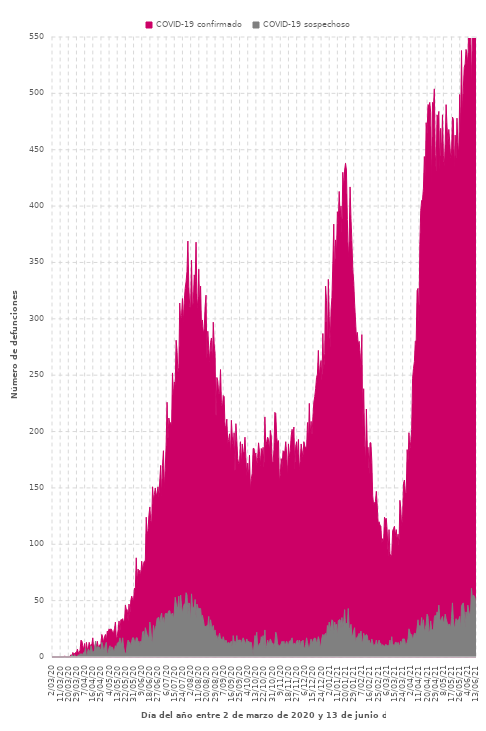
| Category | COVID-19 confirmado | COVID-19 sospechoso |
|---|---|---|
| 2020-03-02 | 0 | 0 |
| 2020-03-03 | 0 | 0 |
| 2020-03-04 | 0 | 0 |
| 2020-03-05 | 0 | 0 |
| 2020-03-06 | 0 | 0 |
| 2020-03-07 | 0 | 0 |
| 2020-03-08 | 0 | 0 |
| 2020-03-09 | 0 | 0 |
| 2020-03-10 | 0 | 0 |
| 2020-03-11 | 0 | 0 |
| 2020-03-12 | 0 | 0 |
| 2020-03-13 | 0 | 0 |
| 2020-03-14 | 0 | 0 |
| 2020-03-15 | 0 | 0 |
| 2020-03-16 | 1 | 0 |
| 2020-03-17 | 0 | 0 |
| 2020-03-18 | 0 | 0 |
| 2020-03-19 | 0 | 0 |
| 2020-03-20 | 0 | 0 |
| 2020-03-21 | 0 | 0 |
| 2020-03-22 | 1 | 0 |
| 2020-03-23 | 2 | 0 |
| 2020-03-24 | 0 | 2 |
| 2020-03-25 | 4 | 1 |
| 2020-03-26 | 3 | 0 |
| 2020-03-27 | 3 | 2 |
| 2020-03-28 | 4 | 0 |
| 2020-03-29 | 4 | 0 |
| 2020-03-30 | 7 | 0 |
| 2020-03-31 | 4 | 2 |
| 2020-04-01 | 4 | 0 |
| 2020-04-02 | 6 | 3 |
| 2020-04-03 | 15 | 1 |
| 2020-04-04 | 14 | 3 |
| 2020-04-05 | 10 | 1 |
| 2020-04-06 | 6 | 4 |
| 2020-04-07 | 12 | 4 |
| 2020-04-08 | 3 | 8 |
| 2020-04-09 | 13 | 0 |
| 2020-04-10 | 7 | 3 |
| 2020-04-11 | 7 | 7 |
| 2020-04-12 | 13 | 6 |
| 2020-04-13 | 10 | 2 |
| 2020-04-14 | 11 | 10 |
| 2020-04-15 | 11 | 7 |
| 2020-04-16 | 17 | 2 |
| 2020-04-17 | 8 | 5 |
| 2020-04-18 | 9 | 6 |
| 2020-04-19 | 12 | 14 |
| 2020-04-20 | 9 | 6 |
| 2020-04-21 | 14 | 9 |
| 2020-04-22 | 9 | 9 |
| 2020-04-23 | 10 | 9 |
| 2020-04-24 | 11 | 6 |
| 2020-04-25 | 12 | 7 |
| 2020-04-26 | 20 | 13 |
| 2020-04-27 | 17 | 10 |
| 2020-04-28 | 13 | 5 |
| 2020-04-29 | 18 | 7 |
| 2020-04-30 | 20 | 11 |
| 2020-05-01 | 14 | 13 |
| 2020-05-02 | 23 | 2 |
| 2020-05-03 | 22 | 4 |
| 2020-05-04 | 25 | 8 |
| 2020-05-05 | 24 | 10 |
| 2020-05-06 | 25 | 6 |
| 2020-05-07 | 24 | 9 |
| 2020-05-08 | 21 | 8 |
| 2020-05-09 | 22 | 5 |
| 2020-05-10 | 25 | 6 |
| 2020-05-11 | 31 | 10 |
| 2020-05-12 | 16 | 7 |
| 2020-05-13 | 18 | 12 |
| 2020-05-14 | 24 | 13 |
| 2020-05-15 | 32 | 13 |
| 2020-05-16 | 22 | 17 |
| 2020-05-17 | 33 | 12 |
| 2020-05-18 | 33 | 12 |
| 2020-05-19 | 34 | 17 |
| 2020-05-20 | 31 | 9 |
| 2020-05-21 | 31 | 5 |
| 2020-05-22 | 46 | 3 |
| 2020-05-23 | 42 | 4 |
| 2020-05-24 | 42 | 11 |
| 2020-05-25 | 32 | 15 |
| 2020-05-26 | 47 | 13 |
| 2020-05-27 | 37 | 13 |
| 2020-05-28 | 50 | 9 |
| 2020-05-29 | 54 | 14 |
| 2020-05-30 | 51 | 17 |
| 2020-05-31 | 50 | 17 |
| 2020-06-01 | 61 | 14 |
| 2020-06-02 | 60 | 12 |
| 2020-06-03 | 88 | 17 |
| 2020-06-04 | 65 | 17 |
| 2020-06-05 | 78 | 13 |
| 2020-06-06 | 73 | 14 |
| 2020-06-07 | 77 | 10 |
| 2020-06-08 | 71 | 14 |
| 2020-06-09 | 85 | 13 |
| 2020-06-10 | 77 | 22 |
| 2020-06-11 | 83 | 23 |
| 2020-06-12 | 85 | 15 |
| 2020-06-13 | 85 | 26 |
| 2020-06-14 | 124 | 23 |
| 2020-06-15 | 109 | 20 |
| 2020-06-16 | 112 | 18 |
| 2020-06-17 | 126 | 15 |
| 2020-06-18 | 133 | 31 |
| 2020-06-19 | 121 | 25 |
| 2020-06-20 | 119 | 15 |
| 2020-06-21 | 151 | 12 |
| 2020-06-22 | 139 | 28 |
| 2020-06-23 | 144 | 21 |
| 2020-06-24 | 150 | 26 |
| 2020-06-25 | 142 | 28 |
| 2020-06-26 | 146 | 34 |
| 2020-06-27 | 151 | 35 |
| 2020-06-28 | 142 | 35 |
| 2020-06-29 | 157 | 28 |
| 2020-06-30 | 170 | 36 |
| 2020-07-01 | 143 | 39 |
| 2020-07-02 | 170 | 30 |
| 2020-07-03 | 183 | 35 |
| 2020-07-04 | 149 | 27 |
| 2020-07-05 | 167 | 38 |
| 2020-07-06 | 188 | 39 |
| 2020-07-07 | 226 | 36 |
| 2020-07-08 | 191 | 39 |
| 2020-07-09 | 212 | 41 |
| 2020-07-10 | 207 | 41 |
| 2020-07-11 | 208 | 36 |
| 2020-07-12 | 204 | 38 |
| 2020-07-13 | 252 | 39 |
| 2020-07-14 | 231 | 33 |
| 2020-07-15 | 244 | 40 |
| 2020-07-16 | 241 | 53 |
| 2020-07-17 | 281 | 48 |
| 2020-07-18 | 272 | 42 |
| 2020-07-19 | 252 | 45 |
| 2020-07-20 | 257 | 54 |
| 2020-07-21 | 314 | 35 |
| 2020-07-22 | 298 | 55 |
| 2020-07-23 | 303 | 45 |
| 2020-07-24 | 318 | 38 |
| 2020-07-25 | 297 | 44 |
| 2020-07-26 | 316 | 47 |
| 2020-07-27 | 327 | 47 |
| 2020-07-28 | 333 | 57 |
| 2020-07-29 | 342 | 55 |
| 2020-07-30 | 369 | 38 |
| 2020-07-31 | 329 | 48 |
| 2020-08-01 | 311 | 47 |
| 2020-08-02 | 310 | 30 |
| 2020-08-03 | 352 | 56 |
| 2020-08-04 | 310 | 44 |
| 2020-08-05 | 315 | 44 |
| 2020-08-06 | 339 | 44 |
| 2020-08-07 | 333 | 51 |
| 2020-08-08 | 368 | 34 |
| 2020-08-09 | 318 | 47 |
| 2020-08-10 | 309 | 44 |
| 2020-08-11 | 344 | 43 |
| 2020-08-12 | 310 | 43 |
| 2020-08-13 | 329 | 43 |
| 2020-08-14 | 293 | 34 |
| 2020-08-15 | 299 | 37 |
| 2020-08-16 | 287 | 33 |
| 2020-08-17 | 291 | 28 |
| 2020-08-18 | 311 | 27 |
| 2020-08-19 | 321 | 27 |
| 2020-08-20 | 263 | 28 |
| 2020-08-21 | 289 | 28 |
| 2020-08-22 | 274 | 36 |
| 2020-08-23 | 262 | 21 |
| 2020-08-24 | 279 | 33 |
| 2020-08-25 | 283 | 28 |
| 2020-08-26 | 258 | 25 |
| 2020-08-27 | 297 | 28 |
| 2020-08-28 | 278 | 21 |
| 2020-08-29 | 269 | 24 |
| 2020-08-30 | 208 | 17 |
| 2020-08-31 | 248 | 19 |
| 2020-09-01 | 245 | 14 |
| 2020-09-02 | 234 | 18 |
| 2020-09-03 | 234 | 21 |
| 2020-09-04 | 255 | 16 |
| 2020-09-05 | 226 | 16 |
| 2020-09-06 | 220 | 14 |
| 2020-09-07 | 232 | 18 |
| 2020-09-08 | 231 | 15 |
| 2020-09-09 | 203 | 13 |
| 2020-09-10 | 205 | 15 |
| 2020-09-11 | 211 | 13 |
| 2020-09-12 | 189 | 12 |
| 2020-09-13 | 193 | 13 |
| 2020-09-14 | 198 | 12 |
| 2020-09-15 | 178 | 13 |
| 2020-09-16 | 210 | 14 |
| 2020-09-17 | 196 | 6 |
| 2020-09-18 | 185 | 19 |
| 2020-09-19 | 199 | 13 |
| 2020-09-20 | 160 | 14 |
| 2020-09-21 | 207 | 11 |
| 2020-09-22 | 192 | 19 |
| 2020-09-23 | 176 | 12 |
| 2020-09-24 | 172 | 15 |
| 2020-09-25 | 171 | 15 |
| 2020-09-26 | 191 | 15 |
| 2020-09-27 | 170 | 11 |
| 2020-09-28 | 189 | 15 |
| 2020-09-29 | 182 | 17 |
| 2020-09-30 | 181 | 15 |
| 2020-10-01 | 195 | 13 |
| 2020-10-02 | 177 | 12 |
| 2020-10-03 | 160 | 16 |
| 2020-10-04 | 172 | 13 |
| 2020-10-05 | 160 | 14 |
| 2020-10-06 | 179 | 13 |
| 2020-10-07 | 148 | 13 |
| 2020-10-08 | 158 | 13 |
| 2020-10-09 | 163 | 7 |
| 2020-10-10 | 185 | 2 |
| 2020-10-11 | 185 | 10 |
| 2020-10-12 | 178 | 19 |
| 2020-10-13 | 181 | 17 |
| 2020-10-14 | 169 | 22 |
| 2020-10-15 | 177 | 9 |
| 2020-10-16 | 190 | 10 |
| 2020-10-17 | 182 | 12 |
| 2020-10-18 | 170 | 11 |
| 2020-10-19 | 185 | 18 |
| 2020-10-20 | 180 | 15 |
| 2020-10-21 | 186 | 19 |
| 2020-10-22 | 166 | 9 |
| 2020-10-23 | 213 | 24 |
| 2020-10-24 | 187 | 7 |
| 2020-10-25 | 191 | 10 |
| 2020-10-26 | 195 | 15 |
| 2020-10-27 | 193 | 12 |
| 2020-10-28 | 182 | 13 |
| 2020-10-29 | 201 | 16 |
| 2020-10-30 | 196 | 14 |
| 2020-10-31 | 173 | 12 |
| 2020-11-01 | 172 | 12 |
| 2020-11-02 | 184 | 8 |
| 2020-11-03 | 217 | 13 |
| 2020-11-04 | 216 | 22 |
| 2020-11-05 | 195 | 19 |
| 2020-11-06 | 189 | 12 |
| 2020-11-07 | 192 | 10 |
| 2020-11-08 | 156 | 10 |
| 2020-11-09 | 162 | 10 |
| 2020-11-10 | 176 | 12 |
| 2020-11-11 | 169 | 14 |
| 2020-11-12 | 183 | 12 |
| 2020-11-13 | 182 | 14 |
| 2020-11-14 | 182 | 9 |
| 2020-11-15 | 191 | 12 |
| 2020-11-16 | 180 | 14 |
| 2020-11-17 | 160 | 12 |
| 2020-11-18 | 189 | 10 |
| 2020-11-19 | 177 | 14 |
| 2020-11-20 | 183 | 14 |
| 2020-11-21 | 196 | 15 |
| 2020-11-22 | 202 | 17 |
| 2020-11-23 | 196 | 11 |
| 2020-11-24 | 204 | 12 |
| 2020-11-25 | 165 | 12 |
| 2020-11-26 | 187 | 11 |
| 2020-11-27 | 191 | 14 |
| 2020-11-28 | 178 | 15 |
| 2020-11-29 | 193 | 11 |
| 2020-11-30 | 166 | 15 |
| 2020-12-01 | 174 | 8 |
| 2020-12-02 | 189 | 14 |
| 2020-12-03 | 183 | 12 |
| 2020-12-04 | 177 | 15 |
| 2020-12-05 | 191 | 9 |
| 2020-12-06 | 187 | 7 |
| 2020-12-07 | 186 | 11 |
| 2020-12-08 | 185 | 17 |
| 2020-12-09 | 208 | 13 |
| 2020-12-10 | 189 | 9 |
| 2020-12-11 | 225 | 7 |
| 2020-12-12 | 197 | 12 |
| 2020-12-13 | 209 | 16 |
| 2020-12-14 | 196 | 12 |
| 2020-12-15 | 213 | 14 |
| 2020-12-16 | 226 | 16 |
| 2020-12-17 | 231 | 17 |
| 2020-12-18 | 238 | 16 |
| 2020-12-19 | 248 | 12 |
| 2020-12-20 | 251 | 14 |
| 2020-12-21 | 272 | 18 |
| 2020-12-22 | 248 | 15 |
| 2020-12-23 | 258 | 7 |
| 2020-12-24 | 263 | 12 |
| 2020-12-25 | 244 | 17 |
| 2020-12-26 | 287 | 20 |
| 2020-12-27 | 254 | 18 |
| 2020-12-28 | 269 | 20 |
| 2020-12-29 | 329 | 21 |
| 2020-12-30 | 316 | 17 |
| 2020-12-31 | 270 | 28 |
| 2021-01-01 | 335 | 24 |
| 2021-01-02 | 302 | 31 |
| 2021-01-03 | 275 | 23 |
| 2021-01-04 | 308 | 28 |
| 2021-01-05 | 319 | 33 |
| 2021-01-06 | 349 | 32 |
| 2021-01-07 | 384 | 19 |
| 2021-01-08 | 336 | 31 |
| 2021-01-09 | 370 | 27 |
| 2021-01-10 | 357 | 29 |
| 2021-01-11 | 395 | 18 |
| 2021-01-12 | 385 | 32 |
| 2021-01-13 | 413 | 33 |
| 2021-01-14 | 390 | 33 |
| 2021-01-15 | 400 | 25 |
| 2021-01-16 | 376 | 35 |
| 2021-01-17 | 430 | 25 |
| 2021-01-18 | 415 | 32 |
| 2021-01-19 | 432 | 42 |
| 2021-01-20 | 438 | 27 |
| 2021-01-21 | 432 | 30 |
| 2021-01-22 | 388 | 29 |
| 2021-01-23 | 353 | 43 |
| 2021-01-24 | 369 | 26 |
| 2021-01-25 | 417 | 24 |
| 2021-01-26 | 389 | 29 |
| 2021-01-27 | 369 | 19 |
| 2021-01-28 | 344 | 19 |
| 2021-01-29 | 333 | 23 |
| 2021-01-30 | 314 | 26 |
| 2021-01-31 | 299 | 12 |
| 2021-02-01 | 283 | 17 |
| 2021-02-02 | 288 | 17 |
| 2021-02-03 | 277 | 19 |
| 2021-02-04 | 280 | 21 |
| 2021-02-05 | 270 | 16 |
| 2021-02-06 | 256 | 23 |
| 2021-02-07 | 286 | 14 |
| 2021-02-08 | 199 | 13 |
| 2021-02-09 | 238 | 21 |
| 2021-02-10 | 196 | 18 |
| 2021-02-11 | 169 | 19 |
| 2021-02-12 | 220 | 20 |
| 2021-02-13 | 186 | 19 |
| 2021-02-14 | 186 | 13 |
| 2021-02-15 | 162 | 15 |
| 2021-02-16 | 190 | 12 |
| 2021-02-17 | 190 | 12 |
| 2021-02-18 | 174 | 16 |
| 2021-02-19 | 143 | 13 |
| 2021-02-20 | 135 | 9 |
| 2021-02-21 | 137 | 11 |
| 2021-02-22 | 138 | 11 |
| 2021-02-23 | 147 | 15 |
| 2021-02-24 | 134 | 11 |
| 2021-02-25 | 118 | 11 |
| 2021-02-26 | 120 | 15 |
| 2021-02-27 | 117 | 12 |
| 2021-02-28 | 116 | 12 |
| 2021-03-01 | 101 | 8 |
| 2021-03-02 | 105 | 11 |
| 2021-03-03 | 102 | 10 |
| 2021-03-04 | 124 | 9 |
| 2021-03-05 | 122 | 11 |
| 2021-03-06 | 123 | 11 |
| 2021-03-07 | 111 | 10 |
| 2021-03-08 | 90 | 10 |
| 2021-03-09 | 113 | 10 |
| 2021-03-10 | 92 | 15 |
| 2021-03-11 | 89 | 8 |
| 2021-03-12 | 91 | 18 |
| 2021-03-13 | 112 | 9 |
| 2021-03-14 | 114 | 11 |
| 2021-03-15 | 116 | 10 |
| 2021-03-16 | 108 | 13 |
| 2021-03-17 | 113 | 13 |
| 2021-03-18 | 103 | 10 |
| 2021-03-19 | 109 | 13 |
| 2021-03-20 | 98 | 9 |
| 2021-03-21 | 139 | 11 |
| 2021-03-22 | 132 | 14 |
| 2021-03-23 | 115 | 11 |
| 2021-03-24 | 125 | 16 |
| 2021-03-25 | 154 | 16 |
| 2021-03-26 | 157 | 16 |
| 2021-03-27 | 146 | 12 |
| 2021-03-28 | 146 | 11 |
| 2021-03-29 | 184 | 13 |
| 2021-03-30 | 173 | 16 |
| 2021-03-31 | 199 | 25 |
| 2021-04-01 | 183 | 22 |
| 2021-04-02 | 191 | 19 |
| 2021-04-03 | 202 | 20 |
| 2021-04-04 | 247 | 15 |
| 2021-04-05 | 256 | 18 |
| 2021-04-06 | 262 | 21 |
| 2021-04-07 | 280 | 21 |
| 2021-04-08 | 281 | 19 |
| 2021-04-09 | 325 | 26 |
| 2021-04-10 | 327 | 33 |
| 2021-04-11 | 297 | 24 |
| 2021-04-12 | 366 | 28 |
| 2021-04-13 | 396 | 26 |
| 2021-04-14 | 405 | 35 |
| 2021-04-15 | 406 | 26 |
| 2021-04-16 | 416 | 33 |
| 2021-04-17 | 444 | 22 |
| 2021-04-18 | 424 | 25 |
| 2021-04-19 | 474 | 29 |
| 2021-04-20 | 463 | 38 |
| 2021-04-21 | 490 | 36 |
| 2021-04-22 | 489 | 22 |
| 2021-04-23 | 492 | 23 |
| 2021-04-24 | 483 | 32 |
| 2021-04-25 | 420 | 25 |
| 2021-04-26 | 492 | 24 |
| 2021-04-27 | 487 | 24 |
| 2021-04-28 | 504 | 35 |
| 2021-04-29 | 446 | 37 |
| 2021-04-30 | 431 | 33 |
| 2021-05-01 | 481 | 40 |
| 2021-05-02 | 477 | 37 |
| 2021-05-03 | 484 | 46 |
| 2021-05-04 | 428 | 34 |
| 2021-05-05 | 469 | 31 |
| 2021-05-06 | 444 | 34 |
| 2021-05-07 | 481 | 36 |
| 2021-05-08 | 445 | 30 |
| 2021-05-09 | 434 | 32 |
| 2021-05-10 | 456 | 38 |
| 2021-05-11 | 490 | 34 |
| 2021-05-12 | 471 | 31 |
| 2021-05-13 | 457 | 28 |
| 2021-05-14 | 468 | 29 |
| 2021-05-15 | 457 | 29 |
| 2021-05-16 | 443 | 25 |
| 2021-05-17 | 447 | 35 |
| 2021-05-18 | 479 | 48 |
| 2021-05-19 | 477 | 34 |
| 2021-05-20 | 431 | 25 |
| 2021-05-21 | 463 | 28 |
| 2021-05-22 | 440 | 34 |
| 2021-05-23 | 478 | 30 |
| 2021-05-24 | 456 | 33 |
| 2021-05-25 | 445 | 33 |
| 2021-05-26 | 499 | 36 |
| 2021-05-27 | 465 | 24 |
| 2021-05-28 | 538 | 45 |
| 2021-05-29 | 482 | 47 |
| 2021-05-30 | 504 | 48 |
| 2021-05-31 | 523 | 40 |
| 2021-06-01 | 526 | 27 |
| 2021-06-02 | 539 | 40 |
| 2021-06-03 | 534 | 34 |
| 2021-06-04 | 525 | 46 |
| 2021-06-05 | 560 | 41 |
| 2021-06-06 | 554 | 37 |
| 2021-06-07 | 563 | 39 |
| 2021-06-08 | 506 | 61 |
| 2021-06-09 | 549 | 52 |
| 2021-06-10 | 567 | 55 |
| 2021-06-11 | 582 | 54 |
| 2021-06-12 | 569 | 52 |
| 2021-06-13 | 580 | 44 |